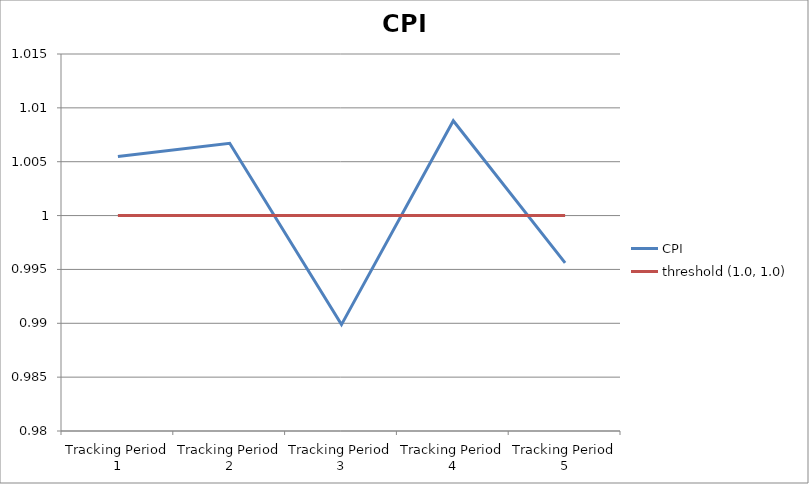
| Category | CPI | threshold (1.0, 1.0) |
|---|---|---|
| Tracking Period 1 | 1.005 | 1 |
| Tracking Period 2 | 1.007 | 1 |
| Tracking Period 3 | 0.99 | 1 |
| Tracking Period 4 | 1.009 | 1 |
| Tracking Period 5 | 0.996 | 1 |